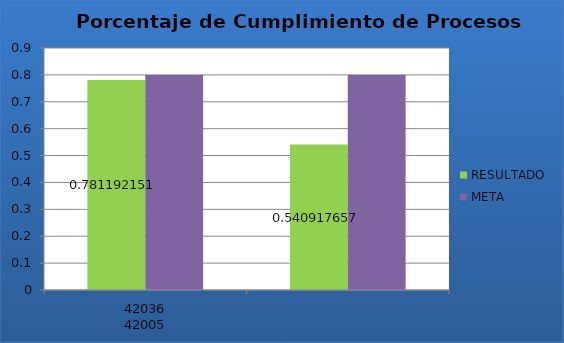
| Category | RESULTADO | META |
|---|---|---|
| 0 | 0.781 | 0.8 |
| 1 | 0.541 | 0.8 |